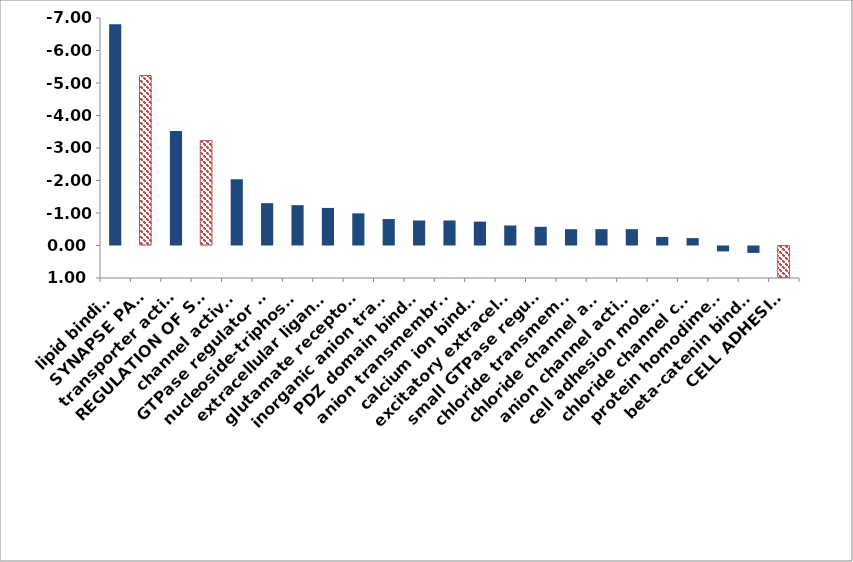
| Category | ∆ log p |
|---|---|
| lipid binding | -6.809 |
| SYNAPSE PART | -5.23 |
| transporter activity | -3.523 |
| REGULATION OF SYNAPTIC PLASTICITY | -3.227 |
| channel activity | -2.041 |
| GTPase regulator activity | -1.303 |
| nucleoside-triphosphatase regulator activity | -1.242 |
| extracellular ligand-gated ion channel activity | -1.156 |
| glutamate receptor activity | -0.989 |
| inorganic anion transmembrane transporter activity | -0.814 |
| PDZ domain binding | -0.77 |
| anion transmembrane transporter activity | -0.77 |
| calcium ion binding | -0.734 |
| excitatory extracellular ligand-gated ion channel activity | -0.615 |
| small GTPase regulator activity | -0.576 |
| chloride transmembrane transporter activity | -0.502 |
| chloride channel activity | -0.502 |
| anion channel activity | -0.502 |
| cell adhesion molecule binding | -0.263 |
| chloride channel complex | -0.228 |
| protein homodimerization activity | 0.181 |
| beta-catenin binding | 0.228 |
| CELL ADHESION | 1.229 |